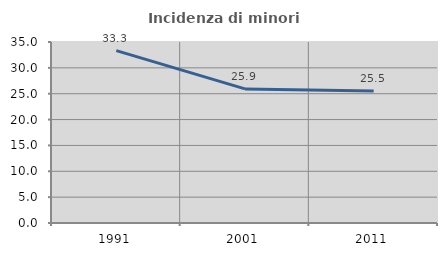
| Category | Incidenza di minori stranieri |
|---|---|
| 1991.0 | 33.333 |
| 2001.0 | 25.926 |
| 2011.0 | 25.547 |